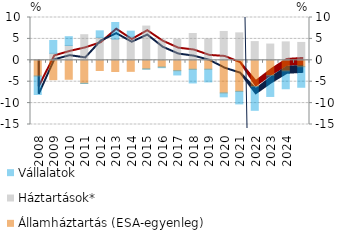
| Category | Államháztartás (ESA-egyenleg) | Háztartások* | Vállalatok |
|---|---|---|---|
| 2008.0 | -3.672 | 0.06 | -4.324 |
| 2009.0 | -4.521 | 1.631 | 3.004 |
| 2010.0 | -4.43 | 3.469 | 2.049 |
| 2011.0 | -5.368 | 5.98 | -0.054 |
| 2012.0 | -2.381 | 5.354 | 1.531 |
| 2013.0 | -2.611 | 4.941 | 3.894 |
| 2014.0 | -2.581 | 5.446 | 1.367 |
| 2015.0 | -2.003 | 7.997 | -0.093 |
| 2016.0 | -1.573 | 4.78 | -0.154 |
| 2017.0 | -2.428 | 4.896 | -0.998 |
| 2018.0 | -2.094 | 6.26 | -3.197 |
| 2019.0 | -2.078 | 5.012 | -2.975 |
| 2020.0 | -7.623 | 6.742 | -0.911 |
| 2021.0 | -7.254 | 6.411 | -2.937 |
| 2022.0 | -6.126 | 4.369 | -5.562 |
| 2023.0 | -3.539 | 3.801 | -4.909 |
| 2024.0 | -2.476 | 4.304 | -4.173 |
| 2025.0 | -1.496 | 4.178 | -4.802 |